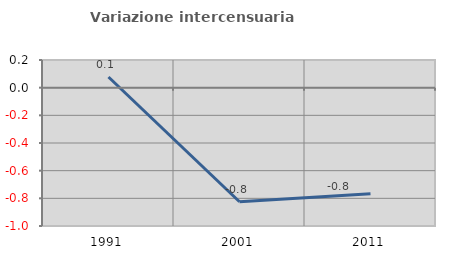
| Category | Variazione intercensuaria annua |
|---|---|
| 1991.0 | 0.077 |
| 2001.0 | -0.825 |
| 2011.0 | -0.767 |